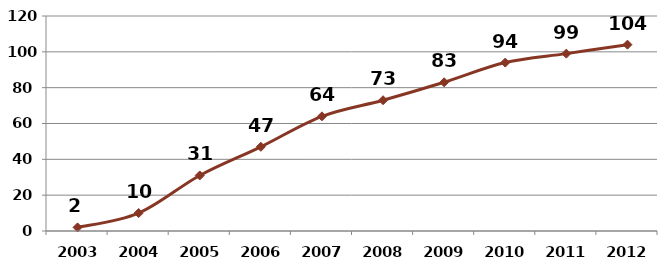
| Category | #REF! |
|---|---|
| 2003.0 | 2 |
| 2004.0 | 10 |
| 2005.0 | 31 |
| 2006.0 | 47 |
| 2007.0 | 64 |
| 2008.0 | 73 |
| 2009.0 | 83 |
| 2010.0 | 94 |
| 2011.0 | 99 |
| 2012.0 | 104 |